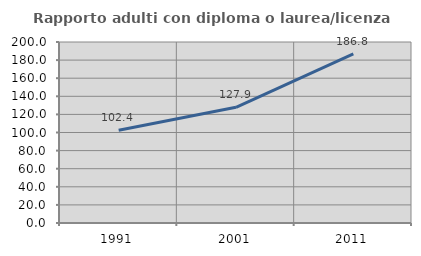
| Category | Rapporto adulti con diploma o laurea/licenza media  |
|---|---|
| 1991.0 | 102.445 |
| 2001.0 | 127.866 |
| 2011.0 | 186.822 |